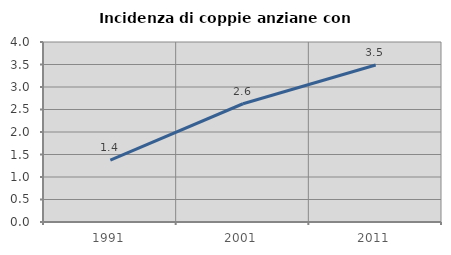
| Category | Incidenza di coppie anziane con figli |
|---|---|
| 1991.0 | 1.376 |
| 2001.0 | 2.628 |
| 2011.0 | 3.49 |